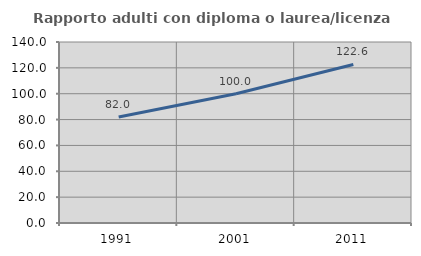
| Category | Rapporto adulti con diploma o laurea/licenza media  |
|---|---|
| 1991.0 | 81.991 |
| 2001.0 | 100 |
| 2011.0 | 122.636 |